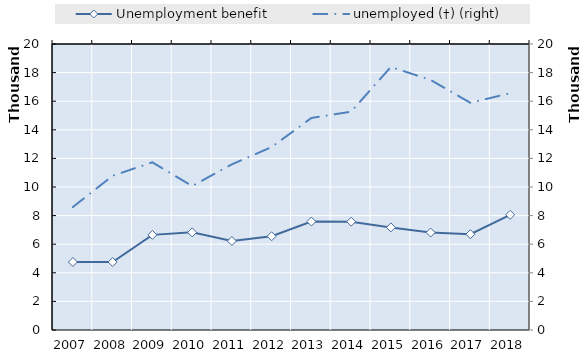
| Category | 0 | Series 14 | Series 15 | Series 16 | Series 17 | Series 18 | Series 19 | Unemployment benefit |
|---|---|---|---|---|---|---|---|---|
| 2007.0 |  |  |  |  |  |  |  | 4755 |
| 2008.0 |  |  |  |  |  |  |  | 4751 |
| 2009.0 |  |  |  |  |  |  |  | 6653 |
| 2010.0 |  |  |  |  |  |  |  | 6828 |
| 2011.0 |  |  |  |  |  |  |  | 6222 |
| 2012.0 |  |  |  |  |  |  |  | 6554 |
| 2013.0 |  |  |  |  |  |  |  | 7584 |
| 2014.0 |  |  |  |  |  |  |  | 7572 |
| 2015.0 |  |  |  |  |  |  |  | 7174 |
| 2016.0 |  |  |  |  |  |  |  | 6815 |
| 2017.0 |  |  |  |  |  |  |  | 6700 |
| 2018.0 |  |  |  |  |  |  |  | 8055 |